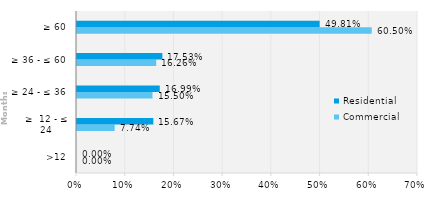
| Category | Commercial | Residential |
|---|---|---|
| >12 | 0 | 0 |
| ≥  12 - ≤ 24 | 0.077 | 0.157 |
| ≥ 24 - ≤ 36 | 0.155 | 0.17 |
| ≥ 36 - ≤ 60 | 0.163 | 0.175 |
| ≥ 60 | 0.605 | 0.498 |